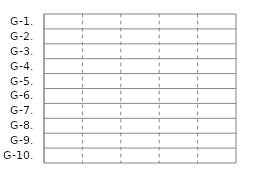
| Category | IN | OUT |
|---|---|---|
| G-1. | 0 | 0 |
| G-2. | 0 | 0 |
| G-3. | 0 | 0 |
| G-4. | 0 | 0 |
| G-5. | 0 | 0 |
| G-6. | 0 | 0 |
| G-7. | 0 | 0 |
| G-8. | 0 | 0 |
| G-9. | 0 | 0 |
| G-10. | 0 | 0 |